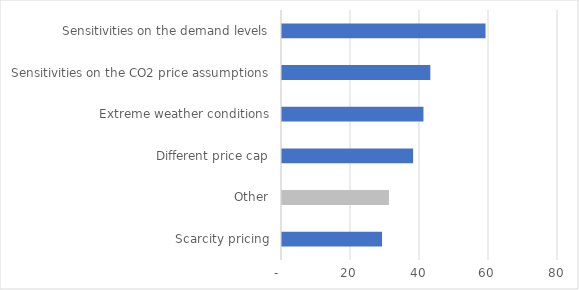
| Category | Priority score (highest = high priority) |
|---|---|
| Scarcity pricing | 29 |
| Other | 31 |
| Different price cap | 38 |
| Extreme weather conditions | 41 |
| Sensitivities on the CO2 price assumptions | 43 |
| Sensitivities on the demand levels | 59 |